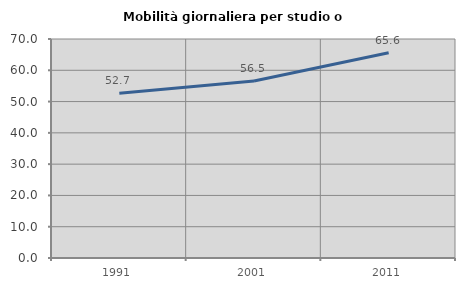
| Category | Mobilità giornaliera per studio o lavoro |
|---|---|
| 1991.0 | 52.685 |
| 2001.0 | 56.55 |
| 2011.0 | 65.584 |